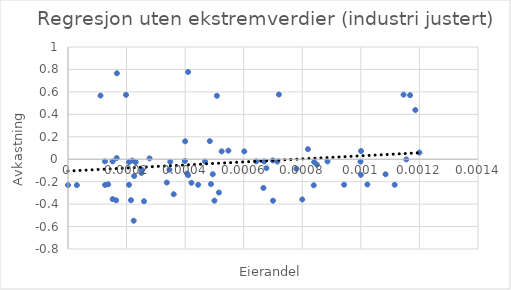
| Category | Summer av alfa |
|---|---|
| 0.0012 | 0.059 |
| 0.001186020139019977 | 0.438 |
| 0.0011680213442347104 | 0.571 |
| 0.0011553190869533444 | -0.002 |
| 0.0011458478338760992 | 0.575 |
| 0.0011154443757192289 | -0.228 |
| 0.0010843163189620288 | -0.134 |
| 0.0010223319461726752 | -0.225 |
| 0.0010006183918867902 | 0.073 |
| 0.0009999908251586977 | -0.139 |
| 0.0009988300305536235 | -0.021 |
| 0.0009427044041259418 | -0.227 |
| 0.0008861980235444139 | -0.02 |
| 0.0008499078682596311 | -0.049 |
| 0.000840726804417122 | -0.025 |
| 0.0008390870070072087 | -0.232 |
| 0.0008191903449479407 | 0.089 |
| 0.0008 | -0.359 |
| 0.0007799970978285392 | -0.086 |
| 0.00072015186675707 | 0.576 |
| 0.0007149598565675485 | -0.021 |
| 0.0007 | -0.37 |
| 0.000699357659883844 | -0.011 |
| 0.0006774924185142361 | -0.08 |
| 0.0006695918020169416 | -0.02 |
| 0.0006672693960784447 | -0.256 |
| 0.0006428551134384107 | -0.019 |
| 0.0006018495806229883 | 0.07 |
| 0.0005476785940811693 | 0.077 |
| 0.0005247466455924037 | 0.07 |
| 0.0005152007740349949 | -0.297 |
| 0.0005084635570901136 | 0.565 |
| 0.0005 | -0.369 |
| 0.0004942704226655578 | -0.133 |
| 0.0004880685234893642 | -0.221 |
| 0.0004842428578682265 | 0.161 |
| 0.00046785156207055235 | -0.02 |
| 0.0004443807727332833 | -0.228 |
| 0.00042150122363745525 | -0.21 |
| 0.00041008365977458837 | 0.777 |
| 0.00041008365977458837 | -0.143 |
| 0.00040691446519699115 | -0.128 |
| 0.0004 | 0.16 |
| 0.0003990322715591934 | -0.016 |
| 0.0003609831443199048 | -0.312 |
| 0.0003489786288085406 | -0.023 |
| 0.00034641073943863295 | -0.094 |
| 0.0003374569664220461 | -0.208 |
| 0.00027844682435660583 | 0.008 |
| 0.0002595313500263658 | -0.374 |
| 0.00025298676391990115 | -0.096 |
| 0.00025064852215895194 | -0.123 |
| 0.00023115298681709233 | -0.026 |
| 0.0002259066787112356 | -0.15 |
| 0.0002243079874956221 | -0.548 |
| 0.00021945210655072655 | -0.012 |
| 0.0002150097562035386 | -0.365 |
| 0.00020851698518656965 | -0.025 |
| 0.00020837098023288898 | -0.228 |
| 0.0001980452650267387 | 0.573 |
| 0.00016696260084055116 | 0.766 |
| 0.00016642098091662047 | 0.01 |
| 0.00016414944962567013 | -0.366 |
| 0.00015238989812994718 | -0.355 |
| 0.0001523884416425563 | -0.019 |
| 0.00013728016980114066 | -0.224 |
| 0.0001265607998158437 | -0.229 |
| 0.00012615069855855925 | -0.019 |
| 0.00011097748891312593 | 0.567 |
| 3.027877476889338e-05 | -0.231 |
| 0.0 | -0.23 |